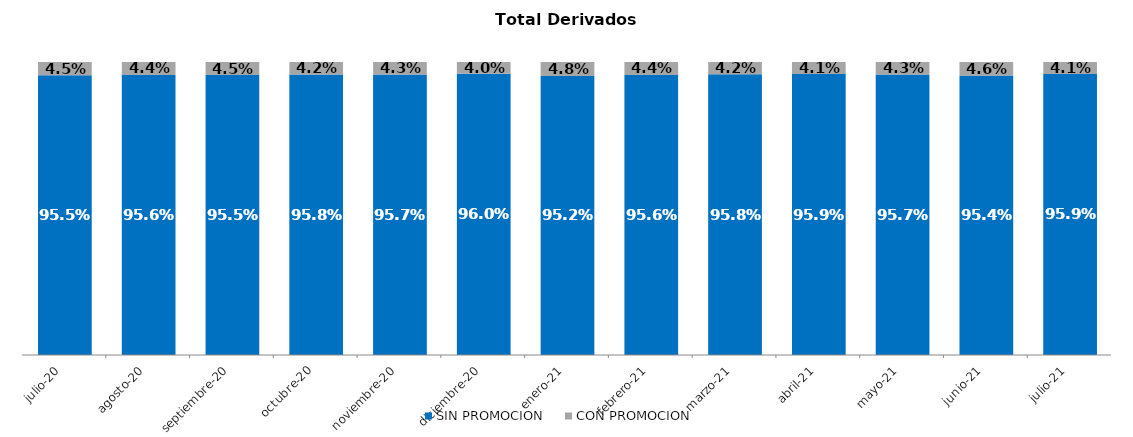
| Category | SIN PROMOCION   | CON PROMOCION   |
|---|---|---|
| 2020-07-01 | 0.955 | 0.045 |
| 2020-08-01 | 0.956 | 0.044 |
| 2020-09-01 | 0.955 | 0.045 |
| 2020-10-01 | 0.958 | 0.042 |
| 2020-11-01 | 0.957 | 0.043 |
| 2020-12-01 | 0.96 | 0.04 |
| 2021-01-01 | 0.952 | 0.048 |
| 2021-02-01 | 0.956 | 0.044 |
| 2021-03-01 | 0.958 | 0.042 |
| 2021-04-01 | 0.959 | 0.041 |
| 2021-05-01 | 0.957 | 0.043 |
| 2021-06-01 | 0.954 | 0.046 |
| 2021-07-01 | 0.959 | 0.041 |